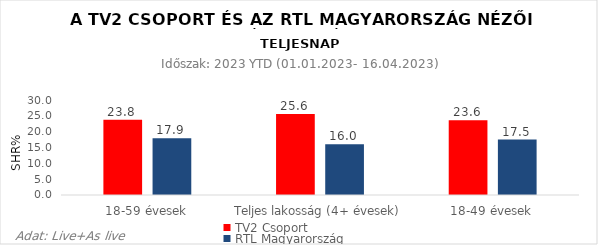
| Category | TV2 Csoport | RTL Magyarország |
|---|---|---|
| 18-59 évesek | 23.8 | 17.9 |
| Teljes lakosság (4+ évesek) | 25.6 | 16 |
| 18-49 évesek | 23.6 | 17.5 |